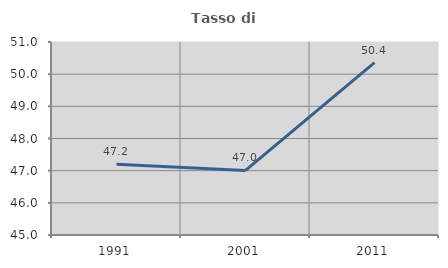
| Category | Tasso di occupazione   |
|---|---|
| 1991.0 | 47.2 |
| 2001.0 | 47.008 |
| 2011.0 | 50.358 |